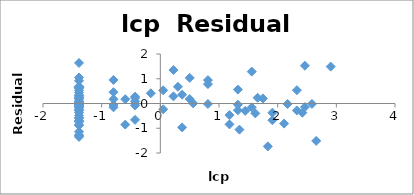
| Category | Series 0 |
|---|---|
| -1.38629436 | -1.305 |
| -1.38629436 | -0.887 |
| -1.38629436 | -0.706 |
| -1.38629436 | -0.747 |
| -1.38629436 | -1.35 |
| -1.38629436 | -0.042 |
| -1.38629436 | -1.141 |
| -1.38629436 | -1.273 |
| -1.38629436 | -0.12 |
| -1.38629436 | -0.259 |
| -1.38629436 | -0.182 |
| -1.38629436 | 0.437 |
| -0.597837 | -0.853 |
| -1.38629436 | -0.572 |
| -0.43078292 | -0.659 |
| -1.38629436 | -0.491 |
| -0.597837 | 0.173 |
| 0.37156356 | -0.966 |
| -1.38629436 | 0.27 |
| -1.38629436 | -0.135 |
| -1.38629436 | -0.368 |
| 1.34807315 | -1.055 |
| -1.38629436 | 0.639 |
| 1.178655 | -0.843 |
| -1.38629436 | -0.064 |
| -1.38629436 | -0.286 |
| -0.7985077 | -0.153 |
| -1.38629436 | 0.194 |
| 0.04879016 | -0.235 |
| 1.61938824 | -0.399 |
| -0.7985077 | -0.06 |
| -1.38629436 | -0.867 |
| -1.38629436 | 0.051 |
| -1.38629436 | 0.653 |
| -0.7985077 | 0.953 |
| -1.38629436 | -0.685 |
| 1.65822808 | 0.232 |
| -1.38629436 | 1.05 |
| 1.83258146 | -1.733 |
| -0.16251893 | 0.414 |
| -1.38629436 | 0.248 |
| -1.38629436 | 0.094 |
| -0.43078292 | 0.277 |
| 0.81093022 | -0.017 |
| -0.43078292 | 0.087 |
| -1.38629436 | -0.033 |
| 2.65675691 | -1.512 |
| -0.43078292 | -0.008 |
| -1.38629436 | -0.117 |
| -0.7985077 | 0.456 |
| -1.38629436 | 0.327 |
| -1.38629436 | -0.273 |
| 0.04879016 | 0.532 |
| 1.44691898 | -0.298 |
| -1.38629436 | -0.592 |
| -1.38629436 | -0.101 |
| 0.50077529 | 1.035 |
| -1.38629436 | 0.535 |
| -1.38629436 | 0.695 |
| -1.38629436 | 0.186 |
| -1.38629436 | 0.615 |
| 1.9095425 | -0.677 |
| 1.55814462 | -0.157 |
| 2.1102132 | -0.812 |
| -1.38629436 | 0.337 |
| -0.43078292 | 0.223 |
| 1.32175584 | -0.048 |
| -0.43078292 | -0.078 |
| -1.38629436 | 1.638 |
| -0.7985077 | 0.172 |
| 1.32175584 | -0.271 |
| -1.38629436 | 0.918 |
| 0.22314355 | 0.29 |
| 1.178655 | -0.469 |
| 1.9095425 | -0.372 |
| 2.42036813 | -0.371 |
| 0.50077529 | 0.18 |
| -1.38629436 | 0.073 |
| 2.58399755 | -0.017 |
| 0.37156356 | 0.357 |
| 0.22314355 | 1.352 |
| 2.32727771 | 0.538 |
| 0.55961579 | 0.004 |
| 1.74919985 | 0.204 |
| 0.81093022 | 0.946 |
| 2.32727771 | -0.279 |
| -1.38629436 | 0.673 |
| 0.30010459 | 0.675 |
| 2.46385324 | -0.146 |
| 0.81093022 | 0.784 |
| -1.38629436 | 0.657 |
| -1.38629436 | 0.059 |
| 1.32175584 | 0.562 |
| 2.1690537 | -0.021 |
| 2.46385324 | 1.526 |
| 1.55814462 | 1.29 |
| 2.90416508 | 1.491 |